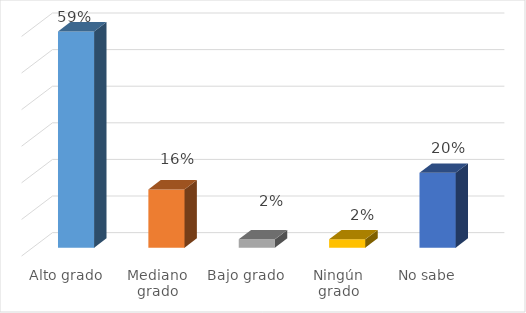
| Category | Series 0 |
|---|---|
| Alto grado | 0.591 |
| Mediano grado | 0.159 |
| Bajo grado | 0.023 |
| Ningún grado | 0.023 |
| No sabe | 0.205 |